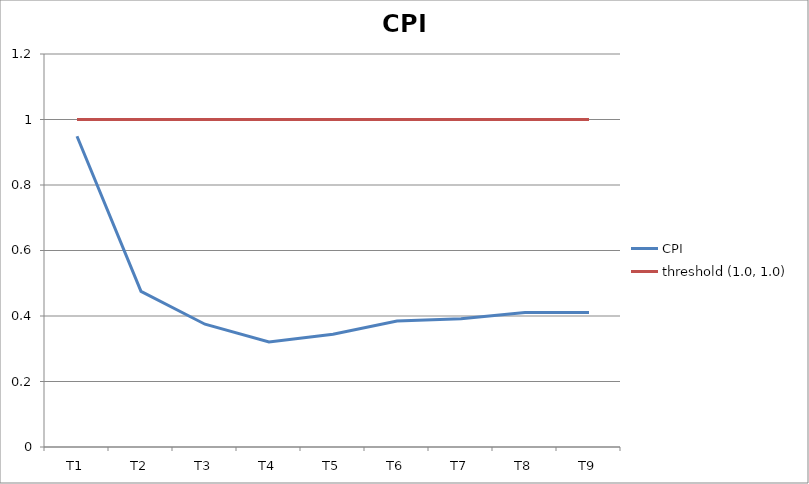
| Category | CPI | threshold (1.0, 1.0) |
|---|---|---|
| T1 | 0.949 | 1 |
| T2 | 0.475 | 1 |
| T3 | 0.375 | 1 |
| T4 | 0.321 | 1 |
| T5 | 0.344 | 1 |
| T6 | 0.385 | 1 |
| T7 | 0.392 | 1 |
| T8 | 0.41 | 1 |
| T9 | 0.41 | 1 |